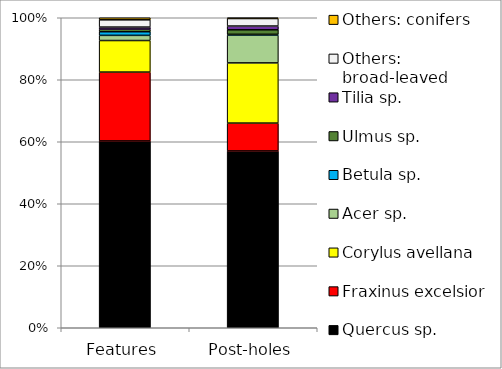
| Category | Quercus sp. | Fraxinus excelsior | Corylus avellana | Acer sp. | Betula sp. | Ulmus sp. | Tilia sp. | Others: broad-leaved | Others: conifers |
|---|---|---|---|---|---|---|---|---|---|
| Features | 361 | 133 | 61 | 10 | 7 | 5 | 4 | 14 | 4 |
| Post-holes | 235 | 37 | 80 | 37 | 1 | 6 | 5 | 10 | 1 |